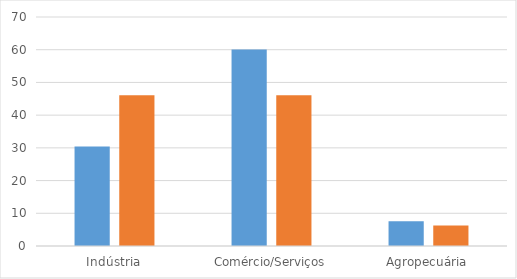
| Category | Series 0 | Series 1 |
|---|---|---|
| Indústria | 30.4 | 46.1 |
| Comércio/Serviços | 60.1 | 46.1 |
| Agropecuária | 7.6 | 6.3 |